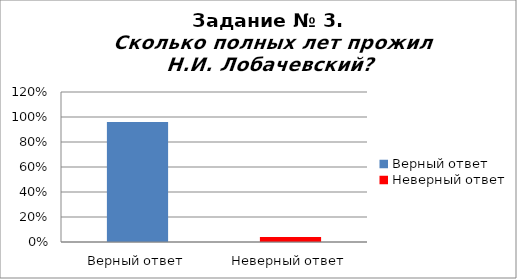
| Category | Сколько полных лет прожил Н.И. Лобачевский? |
|---|---|
| Верный ответ | 0.96 |
| Неверный ответ | 0.04 |